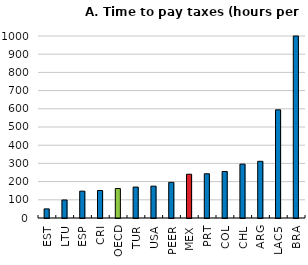
| Category | Series 0 |
|---|---|
| EST | 50 |
| LTU | 99 |
| ESP | 147.5 |
| CRI | 151 |
| OECD | 161.944 |
| TUR | 170 |
| USA | 175 |
| PEER | 195.95 |
| MEX | 240.5 |
| PRT | 243 |
| COL | 255.5 |
| CHL | 296 |
| ARG | 311.5 |
| LAC5 | 594.4 |
| BRA | 1958 |